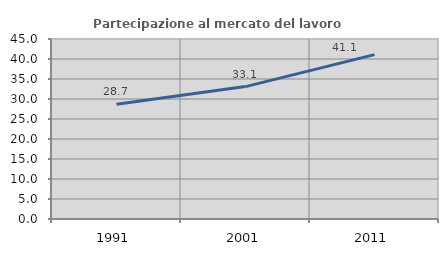
| Category | Partecipazione al mercato del lavoro  femminile |
|---|---|
| 1991.0 | 28.662 |
| 2001.0 | 33.104 |
| 2011.0 | 41.098 |